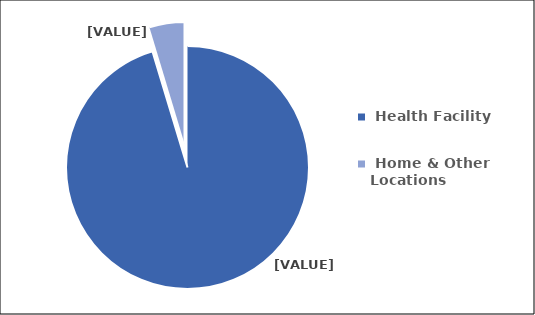
| Category | Series 0 |
|---|---|
|  Health Facility  | 95.336 |
|  Home & Other Locations  | 4.664 |